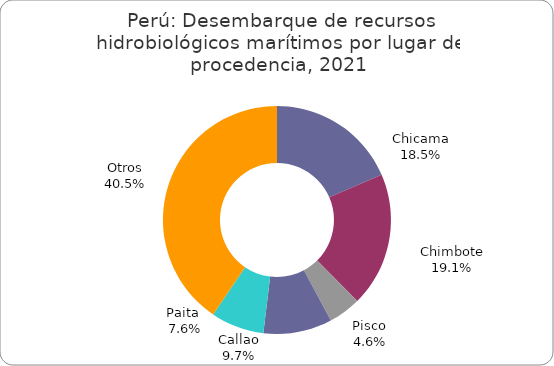
| Category | Series 0 |
|---|---|
| Chicama | 1213964.018 |
| Chimbote | 1251805.508 |
| Pisco | 302581.855 |
| Callao | 638949.223 |
| Paita  | 495711.274 |
| Otros | 2660347.434 |